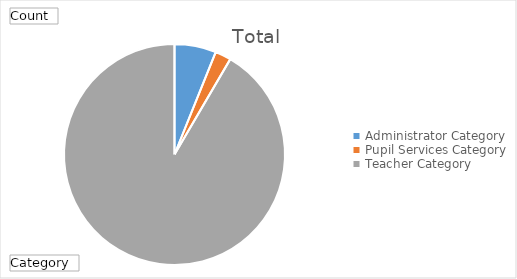
| Category | Total |
|---|---|
| Administrator Category | 162 |
| Pupil Services Category | 62 |
| Teacher Category | 2435 |